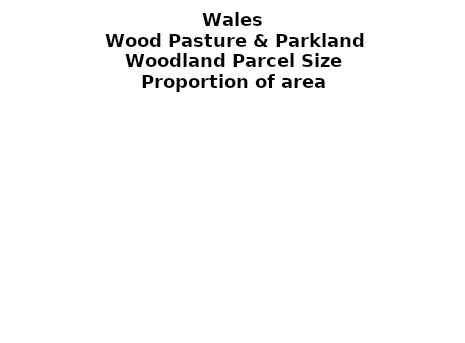
| Category | Wood Pasture & Parkland |
|---|---|
| <5 ha | 0.637 |
| ≥5 and <10 ha | 0 |
| ≥10 and <15 ha | 0.337 |
| ≥15 and <20 ha | 0 |
| ≥20 and <25 ha | 0 |
| ≥25 and <30 ha | 0 |
| ≥30 and <35 ha | 0 |
| ≥35 and <40 ha | 0 |
| ≥40 and <45 ha | 0 |
| ≥45 and <50 ha | 0 |
| ≥50 and <60 ha | 0 |
| ≥60 and <70 ha | 0.025 |
| ≥70 and <80 ha | 0 |
| ≥80 and <90 ha | 0 |
| ≥90 and <100 ha | 0 |
| ≥100 and <150 ha | 0 |
| ≥150 and <200 ha | 0 |
| ≥200 ha | 0 |